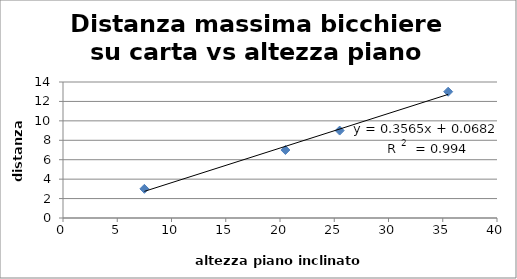
| Category | Series 0 |
|---|---|
| 7.5 | 3 |
| 20.5 | 7 |
| 25.5 | 9 |
| 35.5 | 13 |